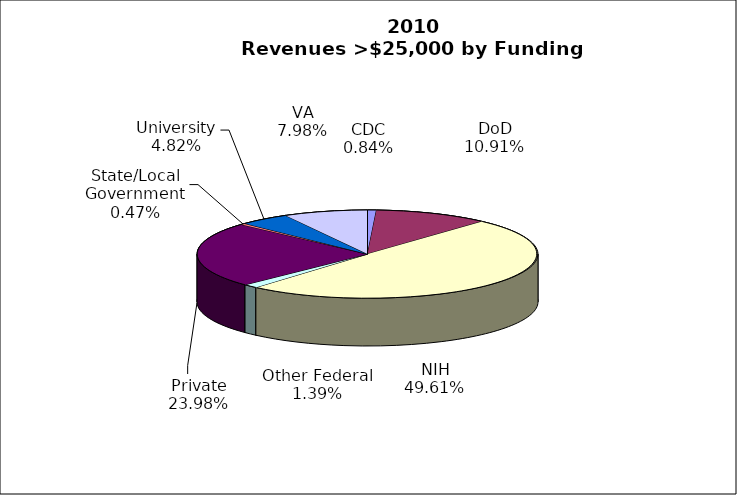
| Category | Series 0 |
|---|---|
| CDC | 1871110 |
| DoD | 24329305 |
| NIH | 110673106 |
| Other Federal | 3106168 |
| Private | 53492072 |
| State/Local Government | 1048073 |
| University | 10752247 |
| VA | 17792871 |